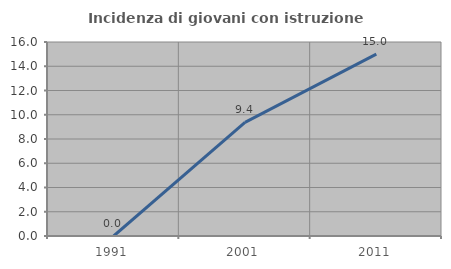
| Category | Incidenza di giovani con istruzione universitaria |
|---|---|
| 1991.0 | 0 |
| 2001.0 | 9.375 |
| 2011.0 | 15 |